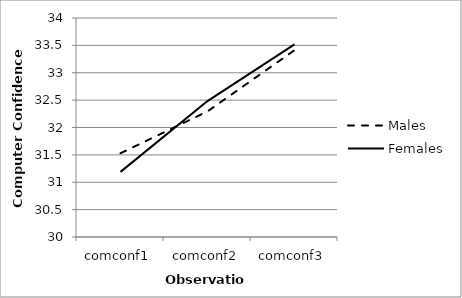
| Category | Males | Females |
|---|---|---|
| comconf1 | 31.529 | 31.19 |
| comconf2 | 32.294 | 32.483 |
| comconf3 | 33.412 | 33.517 |